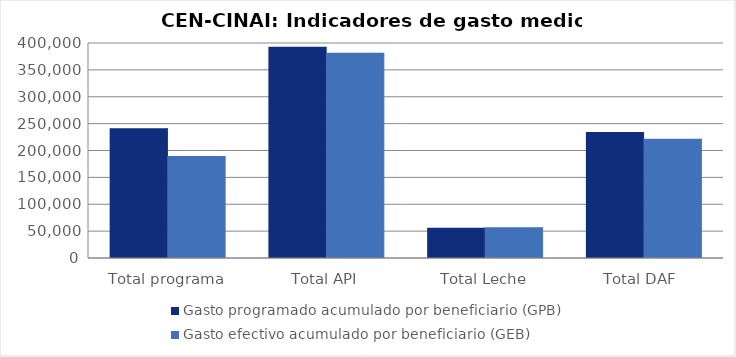
| Category | Gasto programado acumulado por beneficiario (GPB)  | Gasto efectivo acumulado por beneficiario (GEB)  |
|---|---|---|
| Total programa | 241582.975 | 189940.502 |
| Total API | 392938.49 | 381806.64 |
| Total Leche | 56448.534 | 57258.247 |
| Total DAF  | 234312.795 | 221858.045 |